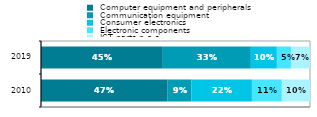
| Category |  Computer equipment and peripherals |  Communication equipment |  Consumer electronics |  Electronic components |  ICT parts n.e.s. |
|---|---|---|---|---|---|
| 2010.0 | 0.471 | 0.089 | 0.225 | 0.111 | 0.105 |
| 2019.0 | 0.453 | 0.327 | 0.097 | 0.052 | 0.071 |